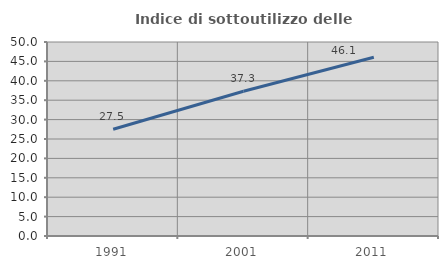
| Category | Indice di sottoutilizzo delle abitazioni  |
|---|---|
| 1991.0 | 27.526 |
| 2001.0 | 37.304 |
| 2011.0 | 46.064 |